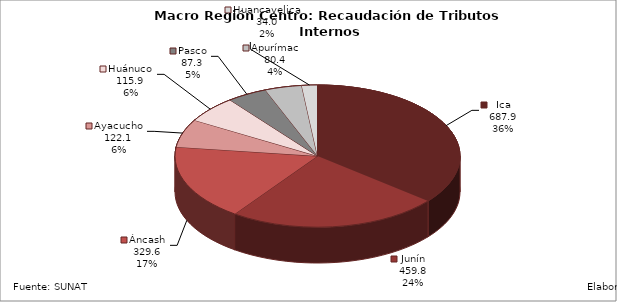
| Category | Series 0 |
|---|---|
| Ica | 687.911 |
| Junín | 459.843 |
| Áncash | 329.627 |
| Ayacucho | 122.13 |
| Huánuco | 115.935 |
| Pasco | 87.291 |
| Apurímac | 80.398 |
| Huancavelica | 34.029 |